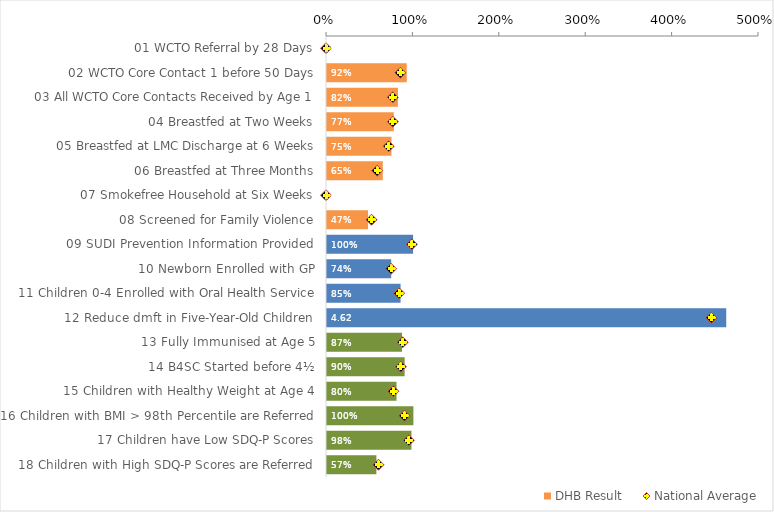
| Category | DHB Result |
|---|---|
| 01 WCTO Referral by 28 Days | 0 |
| 02 WCTO Core Contact 1 before 50 Days | 0.923 |
| 03 All WCTO Core Contacts Received by Age 1 | 0.821 |
| 04 Breastfed at Two Weeks | 0.774 |
| 05 Breastfed at LMC Discharge at 6 Weeks | 0.746 |
| 06 Breastfed at Three Months | 0.646 |
| 07 Smokefree Household at Six Weeks | 0 |
| 08 Screened for Family Violence | 0.474 |
| 09 SUDI Prevention Information Provided | 0.996 |
| 10 Newborn Enrolled with GP | 0.743 |
| 11 Children 0-4 Enrolled with Oral Health Service | 0.852 |
| 12 Reduce dmft in Five-Year-Old Children | 4.621 |
| 13 Fully Immunised at Age 5 | 0.868 |
| 14 B4SC Started before 4½ | 0.898 |
| 15 Children with Healthy Weight at Age 4 | 0.805 |
| 16 Children with BMI > 98th Percentile are Referred | 1 |
| 17 Children have Low SDQ-P Scores | 0.977 |
| 18 Children with High SDQ-P Scores are Referred | 0.571 |